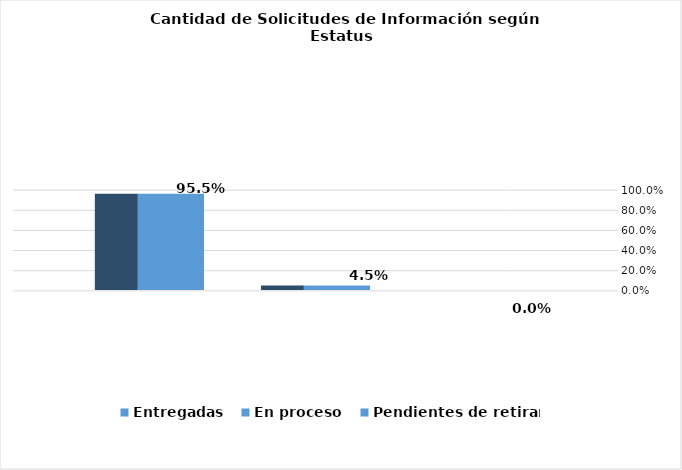
| Category | Entregadas | En proceso | Pendientes de retirar |
|---|---|---|---|
|  | 0.955 | 0.045 | 0 |